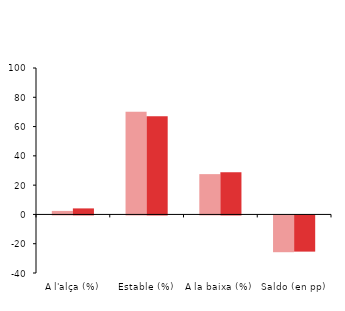
| Category | actual | expectatives a 12 mesos |
|---|---|---|
| A l'alça (%) | 2.393 | 4.116 |
| Estable (%) | 70.09 | 67.056 |
| A la baixa (%) | 27.517 | 28.828 |
| Saldo (en pp) | -25.123 | -24.711 |